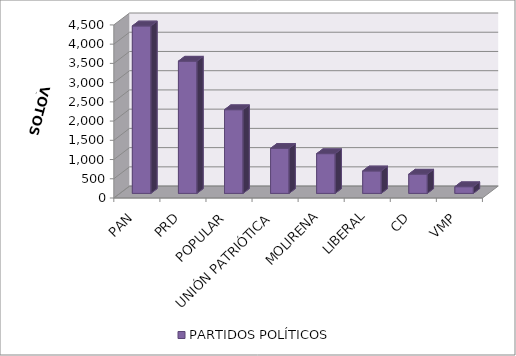
| Category | PARTIDOS POLÍTICOS |
|---|---|
| PAN | 4354 |
| PRD | 3438 |
| POPULAR | 2176 |
| UNIÓN PATRIÓTICA | 1170 |
| MOLIRENA | 1033 |
| LIBERAL | 584 |
| CD | 501 |
| VMP | 174 |